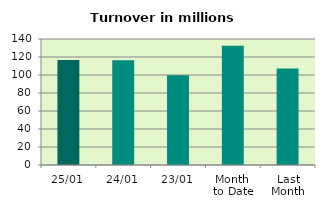
| Category | Series 0 |
|---|---|
| 25/01 | 116.649 |
| 24/01 | 116.252 |
| 23/01 | 99.619 |
| Month 
to Date | 132.427 |
| Last
Month | 107.094 |